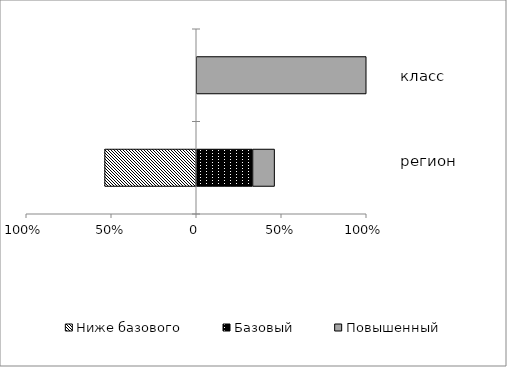
| Category | Ниже базового | Базовый | Повышенный |
|---|---|---|---|
|  | -0.539 | 0.331 | 0.13 |
|  | 0 | 0 | 1 |